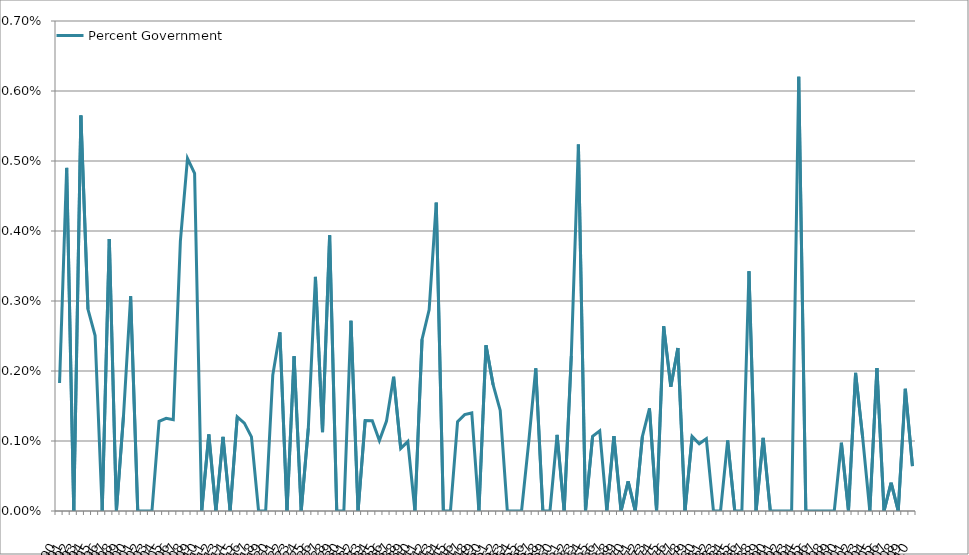
| Category | Percent Government |
|---|---|
| 1890.0 | 0.002 |
| 1891.0 | 0.005 |
| 1892.0 | 0 |
| 1893.0 | 0.006 |
| 1894.0 | 0.003 |
| 1895.0 | 0.003 |
| 1896.0 | 0 |
| 1897.0 | 0.004 |
| 1898.0 | 0 |
| 1899.0 | 0.001 |
| 1900.0 | 0.003 |
| 1901.0 | 0 |
| 1902.0 | 0 |
| 1903.0 | 0 |
| 1904.0 | 0.001 |
| 1905.0 | 0.001 |
| 1906.0 | 0.001 |
| 1907.0 | 0.004 |
| 1908.0 | 0.005 |
| 1909.0 | 0.005 |
| 1910.0 | 0 |
| 1911.0 | 0.001 |
| 1912.0 | 0 |
| 1913.0 | 0.001 |
| 1914.0 | 0 |
| 1915.0 | 0.001 |
| 1916.0 | 0.001 |
| 1917.0 | 0.001 |
| 1918.0 | 0 |
| 1919.0 | 0 |
| 1920.0 | 0.002 |
| 1921.0 | 0.003 |
| 1922.0 | 0 |
| 1923.0 | 0.002 |
| 1924.0 | 0 |
| 1925.0 | 0.001 |
| 1926.0 | 0.003 |
| 1927.0 | 0.001 |
| 1928.0 | 0.004 |
| 1929.0 | 0 |
| 1930.0 | 0 |
| 1931.0 | 0.003 |
| 1932.0 | 0 |
| 1933.0 | 0.001 |
| 1934.0 | 0.001 |
| 1935.0 | 0.001 |
| 1936.0 | 0.001 |
| 1937.0 | 0.002 |
| 1938.0 | 0.001 |
| 1939.0 | 0.001 |
| 1940.0 | 0 |
| 1941.0 | 0.002 |
| 1942.0 | 0.003 |
| 1943.0 | 0.004 |
| 1944.0 | 0 |
| 1945.0 | 0 |
| 1946.0 | 0.001 |
| 1947.0 | 0.001 |
| 1948.0 | 0.001 |
| 1949.0 | 0 |
| 1950.0 | 0.002 |
| 1951.0 | 0.002 |
| 1952.0 | 0.001 |
| 1953.0 | 0 |
| 1954.0 | 0 |
| 1955.0 | 0 |
| 1956.0 | 0.001 |
| 1957.0 | 0.002 |
| 1958.0 | 0 |
| 1959.0 | 0 |
| 1960.0 | 0.001 |
| 1961.0 | 0 |
| 1962.0 | 0.002 |
| 1963.0 | 0.005 |
| 1964.0 | 0 |
| 1965.0 | 0.001 |
| 1966.0 | 0.001 |
| 1967.0 | 0 |
| 1968.0 | 0.001 |
| 1969.0 | 0 |
| 1970.0 | 0 |
| 1971.0 | 0 |
| 1972.0 | 0.001 |
| 1973.0 | 0.001 |
| 1974.0 | 0 |
| 1975.0 | 0.003 |
| 1976.0 | 0.002 |
| 1977.0 | 0.002 |
| 1978.0 | 0 |
| 1979.0 | 0.001 |
| 1980.0 | 0.001 |
| 1981.0 | 0.001 |
| 1982.0 | 0 |
| 1983.0 | 0 |
| 1984.0 | 0.001 |
| 1985.0 | 0 |
| 1986.0 | 0 |
| 1987.0 | 0.003 |
| 1988.0 | 0 |
| 1989.0 | 0.001 |
| 1990.0 | 0 |
| 1991.0 | 0 |
| 1992.0 | 0 |
| 1993.0 | 0 |
| 1994.0 | 0.006 |
| 1995.0 | 0 |
| 1996.0 | 0 |
| 1997.0 | 0 |
| 1998.0 | 0 |
| 1999.0 | 0 |
| 2000.0 | 0.001 |
| 2001.0 | 0 |
| 2002.0 | 0.002 |
| 2003.0 | 0.001 |
| 2004.0 | 0 |
| 2005.0 | 0.002 |
| 2006.0 | 0 |
| 2007.0 | 0 |
| 2008.0 | 0 |
| 2009.0 | 0.002 |
| 2010.0 | 0.001 |